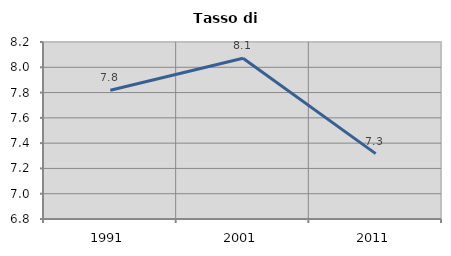
| Category | Tasso di disoccupazione   |
|---|---|
| 1991.0 | 7.819 |
| 2001.0 | 8.072 |
| 2011.0 | 7.317 |